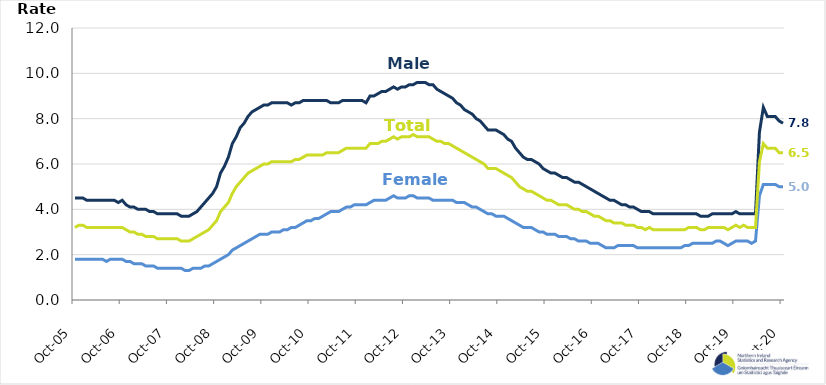
| Category | Male | Female | Total |
|---|---|---|---|
| 2005-10-01 | 4.5 | 1.8 | 3.2 |
| 2005-11-01 | 4.5 | 1.8 | 3.3 |
| 2005-12-01 | 4.5 | 1.8 | 3.3 |
| 2006-01-01 | 4.4 | 1.8 | 3.2 |
| 2006-02-01 | 4.4 | 1.8 | 3.2 |
| 2006-03-01 | 4.4 | 1.8 | 3.2 |
| 2006-04-01 | 4.4 | 1.8 | 3.2 |
| 2006-05-01 | 4.4 | 1.8 | 3.2 |
| 2006-06-01 | 4.4 | 1.7 | 3.2 |
| 2006-07-01 | 4.4 | 1.8 | 3.2 |
| 2006-08-01 | 4.4 | 1.8 | 3.2 |
| 2006-09-01 | 4.3 | 1.8 | 3.2 |
| 2006-10-01 | 4.4 | 1.8 | 3.2 |
| 2006-11-01 | 4.2 | 1.7 | 3.1 |
| 2006-12-01 | 4.1 | 1.7 | 3 |
| 2007-01-01 | 4.1 | 1.6 | 3 |
| 2007-02-01 | 4 | 1.6 | 2.9 |
| 2007-03-01 | 4 | 1.6 | 2.9 |
| 2007-04-01 | 4 | 1.5 | 2.8 |
| 2007-05-01 | 3.9 | 1.5 | 2.8 |
| 2007-06-01 | 3.9 | 1.5 | 2.8 |
| 2007-07-01 | 3.8 | 1.4 | 2.7 |
| 2007-08-01 | 3.8 | 1.4 | 2.7 |
| 2007-09-01 | 3.8 | 1.4 | 2.7 |
| 2007-10-01 | 3.8 | 1.4 | 2.7 |
| 2007-11-01 | 3.8 | 1.4 | 2.7 |
| 2007-12-01 | 3.8 | 1.4 | 2.7 |
| 2008-01-01 | 3.7 | 1.4 | 2.6 |
| 2008-02-01 | 3.7 | 1.3 | 2.6 |
| 2008-03-01 | 3.7 | 1.3 | 2.6 |
| 2008-04-01 | 3.8 | 1.4 | 2.7 |
| 2008-05-01 | 3.9 | 1.4 | 2.8 |
| 2008-06-01 | 4.1 | 1.4 | 2.9 |
| 2008-07-01 | 4.3 | 1.5 | 3 |
| 2008-08-01 | 4.5 | 1.5 | 3.1 |
| 2008-09-01 | 4.7 | 1.6 | 3.3 |
| 2008-10-01 | 5 | 1.7 | 3.5 |
| 2008-11-01 | 5.6 | 1.8 | 3.9 |
| 2008-12-01 | 5.9 | 1.9 | 4.1 |
| 2009-01-01 | 6.3 | 2 | 4.3 |
| 2009-02-01 | 6.9 | 2.2 | 4.7 |
| 2009-03-01 | 7.2 | 2.3 | 5 |
| 2009-04-01 | 7.6 | 2.4 | 5.2 |
| 2009-05-01 | 7.8 | 2.5 | 5.4 |
| 2009-06-01 | 8.1 | 2.6 | 5.6 |
| 2009-07-01 | 8.3 | 2.7 | 5.7 |
| 2009-08-01 | 8.4 | 2.8 | 5.8 |
| 2009-09-01 | 8.5 | 2.9 | 5.9 |
| 2009-10-01 | 8.6 | 2.9 | 6 |
| 2009-11-01 | 8.6 | 2.9 | 6 |
| 2009-12-01 | 8.7 | 3 | 6.1 |
| 2010-01-01 | 8.7 | 3 | 6.1 |
| 2010-02-01 | 8.7 | 3 | 6.1 |
| 2010-03-01 | 8.7 | 3.1 | 6.1 |
| 2010-04-01 | 8.7 | 3.1 | 6.1 |
| 2010-05-01 | 8.6 | 3.2 | 6.1 |
| 2010-06-01 | 8.7 | 3.2 | 6.2 |
| 2010-07-01 | 8.7 | 3.3 | 6.2 |
| 2010-08-01 | 8.8 | 3.4 | 6.3 |
| 2010-09-01 | 8.8 | 3.5 | 6.4 |
| 2010-10-01 | 8.8 | 3.5 | 6.4 |
| 2010-11-01 | 8.8 | 3.6 | 6.4 |
| 2010-12-01 | 8.8 | 3.6 | 6.4 |
| 2011-01-01 | 8.8 | 3.7 | 6.4 |
| 2011-02-01 | 8.8 | 3.8 | 6.5 |
| 2011-03-01 | 8.7 | 3.9 | 6.5 |
| 2011-04-01 | 8.7 | 3.9 | 6.5 |
| 2011-05-01 | 8.7 | 3.9 | 6.5 |
| 2011-06-01 | 8.8 | 4 | 6.6 |
| 2011-07-01 | 8.8 | 4.1 | 6.7 |
| 2011-08-01 | 8.8 | 4.1 | 6.7 |
| 2011-09-01 | 8.8 | 4.2 | 6.7 |
| 2011-10-01 | 8.8 | 4.2 | 6.7 |
| 2011-11-01 | 8.8 | 4.2 | 6.7 |
| 2011-12-01 | 8.7 | 4.2 | 6.7 |
| 2012-01-01 | 9 | 4.3 | 6.9 |
| 2012-02-01 | 9 | 4.4 | 6.9 |
| 2012-03-01 | 9.1 | 4.4 | 6.9 |
| 2012-04-01 | 9.2 | 4.4 | 7 |
| 2012-05-01 | 9.2 | 4.4 | 7 |
| 2012-06-01 | 9.3 | 4.5 | 7.1 |
| 2012-07-01 | 9.4 | 4.6 | 7.2 |
| 2012-08-01 | 9.3 | 4.5 | 7.1 |
| 2012-09-01 | 9.4 | 4.5 | 7.2 |
| 2012-10-01 | 9.4 | 4.5 | 7.2 |
| 2012-11-01 | 9.5 | 4.6 | 7.2 |
| 2012-12-01 | 9.5 | 4.6 | 7.3 |
| 2013-01-01 | 9.6 | 4.5 | 7.2 |
| 2013-02-01 | 9.6 | 4.5 | 7.2 |
| 2013-03-01 | 9.6 | 4.5 | 7.2 |
| 2013-04-01 | 9.5 | 4.5 | 7.2 |
| 2013-05-01 | 9.5 | 4.4 | 7.1 |
| 2013-06-01 | 9.3 | 4.4 | 7 |
| 2013-07-01 | 9.2 | 4.4 | 7 |
| 2013-08-01 | 9.1 | 4.4 | 6.9 |
| 2013-09-01 | 9 | 4.4 | 6.9 |
| 2013-10-01 | 8.9 | 4.4 | 6.8 |
| 2013-11-01 | 8.7 | 4.3 | 6.7 |
| 2013-12-01 | 8.6 | 4.3 | 6.6 |
| 2014-01-01 | 8.4 | 4.3 | 6.5 |
| 2014-02-01 | 8.3 | 4.2 | 6.4 |
| 2014-03-01 | 8.2 | 4.1 | 6.3 |
| 2014-04-01 | 8 | 4.1 | 6.2 |
| 2014-05-01 | 7.9 | 4 | 6.1 |
| 2014-06-01 | 7.7 | 3.9 | 6 |
| 2014-07-01 | 7.5 | 3.8 | 5.8 |
| 2014-08-01 | 7.5 | 3.8 | 5.8 |
| 2014-09-01 | 7.5 | 3.7 | 5.8 |
| 2014-10-01 | 7.4 | 3.7 | 5.7 |
| 2014-11-01 | 7.3 | 3.7 | 5.6 |
| 2014-12-01 | 7.1 | 3.6 | 5.5 |
| 2015-01-01 | 7 | 3.5 | 5.4 |
| 2015-02-01 | 6.7 | 3.4 | 5.2 |
| 2015-03-01 | 6.5 | 3.3 | 5 |
| 2015-04-01 | 6.3 | 3.2 | 4.9 |
| 2015-05-01 | 6.2 | 3.2 | 4.8 |
| 2015-06-01 | 6.2 | 3.2 | 4.8 |
| 2015-07-01 | 6.1 | 3.1 | 4.7 |
| 2015-08-01 | 6 | 3 | 4.6 |
| 2015-09-01 | 5.8 | 3 | 4.5 |
| 2015-10-01 | 5.7 | 2.9 | 4.4 |
| 2015-11-01 | 5.6 | 2.9 | 4.4 |
| 2015-12-01 | 5.6 | 2.9 | 4.3 |
| 2016-01-01 | 5.5 | 2.8 | 4.2 |
| 2016-02-01 | 5.4 | 2.8 | 4.2 |
| 2016-03-01 | 5.4 | 2.8 | 4.2 |
| 2016-04-01 | 5.3 | 2.7 | 4.1 |
| 2016-05-01 | 5.2 | 2.7 | 4 |
| 2016-06-01 | 5.2 | 2.6 | 4 |
| 2016-07-01 | 5.1 | 2.6 | 3.9 |
| 2016-08-01 | 5 | 2.6 | 3.9 |
| 2016-09-01 | 4.9 | 2.5 | 3.8 |
| 2016-10-01 | 4.8 | 2.5 | 3.7 |
| 2016-11-01 | 4.7 | 2.5 | 3.7 |
| 2016-12-01 | 4.6 | 2.4 | 3.6 |
| 2017-01-01 | 4.5 | 2.3 | 3.5 |
| 2017-02-01 | 4.4 | 2.3 | 3.5 |
| 2017-03-01 | 4.4 | 2.3 | 3.4 |
| 2017-04-01 | 4.3 | 2.4 | 3.4 |
| 2017-05-01 | 4.2 | 2.4 | 3.4 |
| 2017-06-01 | 4.2 | 2.4 | 3.3 |
| 2017-07-01 | 4.1 | 2.4 | 3.3 |
| 2017-08-01 | 4.1 | 2.4 | 3.3 |
| 2017-09-01 | 4 | 2.3 | 3.2 |
| 2017-10-01 | 3.9 | 2.3 | 3.2 |
| 2017-11-01 | 3.9 | 2.3 | 3.1 |
| 2017-12-01 | 3.9 | 2.3 | 3.2 |
| 2018-01-01 | 3.8 | 2.3 | 3.1 |
| 2018-02-01 | 3.8 | 2.3 | 3.1 |
| 2018-03-01 | 3.8 | 2.3 | 3.1 |
| 2018-04-01 | 3.8 | 2.3 | 3.1 |
| 2018-05-01 | 3.8 | 2.3 | 3.1 |
| 2018-06-01 | 3.8 | 2.3 | 3.1 |
| 2018-07-01 | 3.8 | 2.3 | 3.1 |
| 2018-08-01 | 3.8 | 2.3 | 3.1 |
| 2018-09-01 | 3.8 | 2.4 | 3.1 |
| 2018-10-01 | 3.8 | 2.4 | 3.2 |
| 2018-11-01 | 3.8 | 2.5 | 3.2 |
| 2018-12-01 | 3.8 | 2.5 | 3.2 |
| 2019-01-01 | 3.7 | 2.5 | 3.1 |
| 2019-02-01 | 3.7 | 2.5 | 3.1 |
| 2019-03-01 | 3.7 | 2.5 | 3.2 |
| 2019-04-01 | 3.8 | 2.5 | 3.2 |
| 2019-05-01 | 3.8 | 2.6 | 3.2 |
| 2019-06-01 | 3.8 | 2.6 | 3.2 |
| 2019-07-01 | 3.8 | 2.5 | 3.2 |
| 2019-08-01 | 3.8 | 2.4 | 3.1 |
| 2019-09-01 | 3.8 | 2.5 | 3.2 |
| 2019-10-01 | 3.9 | 2.6 | 3.3 |
| 2019-11-01 | 3.8 | 2.6 | 3.2 |
| 2019-12-01 | 3.8 | 2.6 | 3.3 |
| 2020-01-01 | 3.8 | 2.6 | 3.2 |
| 2020-02-01 | 3.8 | 2.5 | 3.2 |
| 2020-03-01 | 3.8 | 2.6 | 3.2 |
| 2020-04-01 | 7.4 | 4.6 | 6.1 |
| 2020-05-01 | 8.5 | 5.1 | 6.9 |
| 2020-06-01 | 8.1 | 5.1 | 6.7 |
| 2020-07-01 | 8.1 | 5.1 | 6.7 |
| 2020-08-01 | 8.1 | 5.1 | 6.7 |
| 2020-09-01 | 7.9 | 5 | 6.5 |
| 2020-10-01 | 7.8 | 5 | 6.5 |